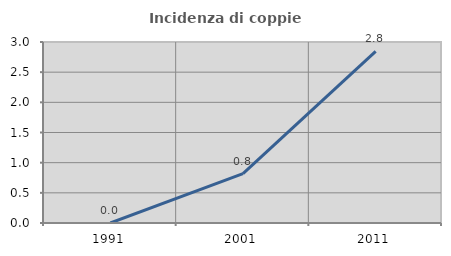
| Category | Incidenza di coppie miste |
|---|---|
| 1991.0 | 0 |
| 2001.0 | 0.817 |
| 2011.0 | 2.846 |